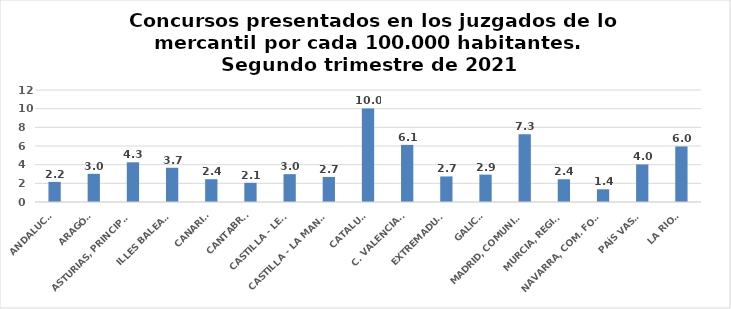
| Category | Series 0 |
|---|---|
| ANDALUCÍA | 2.154 |
| ARAGÓN | 3.018 |
| ASTURIAS, PRINCIPADO | 4.251 |
| ILLES BALEARS | 3.668 |
| CANARIAS | 2.441 |
| CANTABRIA | 2.054 |
| CASTILLA - LEÓN | 2.982 |
| CASTILLA - LA MANCHA | 2.686 |
| CATALUÑA | 10.03 |
| C. VALENCIANA | 6.12 |
| EXTREMADURA | 2.739 |
| GALICIA | 2.932 |
| MADRID, COMUNIDAD | 7.264 |
| MURCIA, REGIÓN | 2.438 |
| NAVARRA, COM. FORAL | 1.362 |
| PAÍS VASCO | 4.022 |
| LA RIOJA | 5.952 |